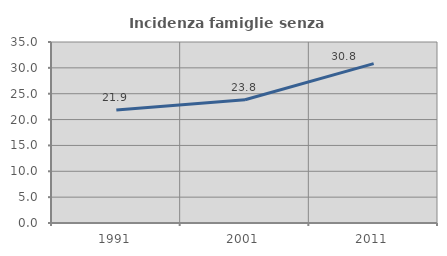
| Category | Incidenza famiglie senza nuclei |
|---|---|
| 1991.0 | 21.867 |
| 2001.0 | 23.831 |
| 2011.0 | 30.81 |